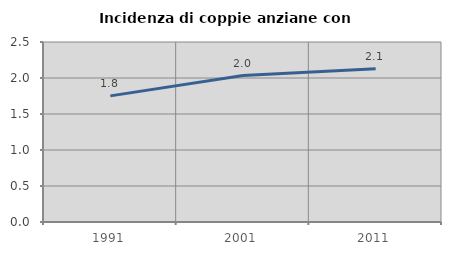
| Category | Incidenza di coppie anziane con figli |
|---|---|
| 1991.0 | 1.752 |
| 2001.0 | 2.034 |
| 2011.0 | 2.128 |